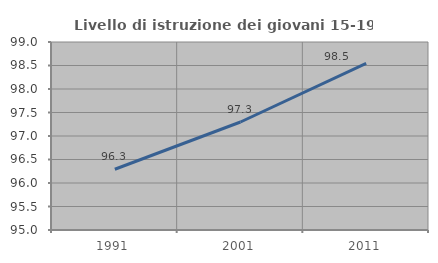
| Category | Livello di istruzione dei giovani 15-19 anni |
|---|---|
| 1991.0 | 96.293 |
| 2001.0 | 97.298 |
| 2011.0 | 98.547 |